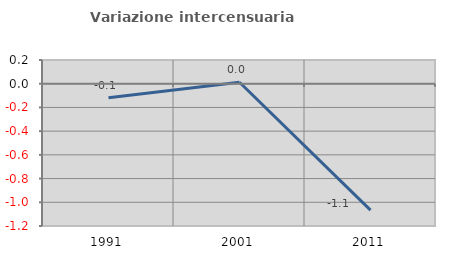
| Category | Variazione intercensuaria annua |
|---|---|
| 1991.0 | -0.119 |
| 2001.0 | 0.012 |
| 2011.0 | -1.067 |